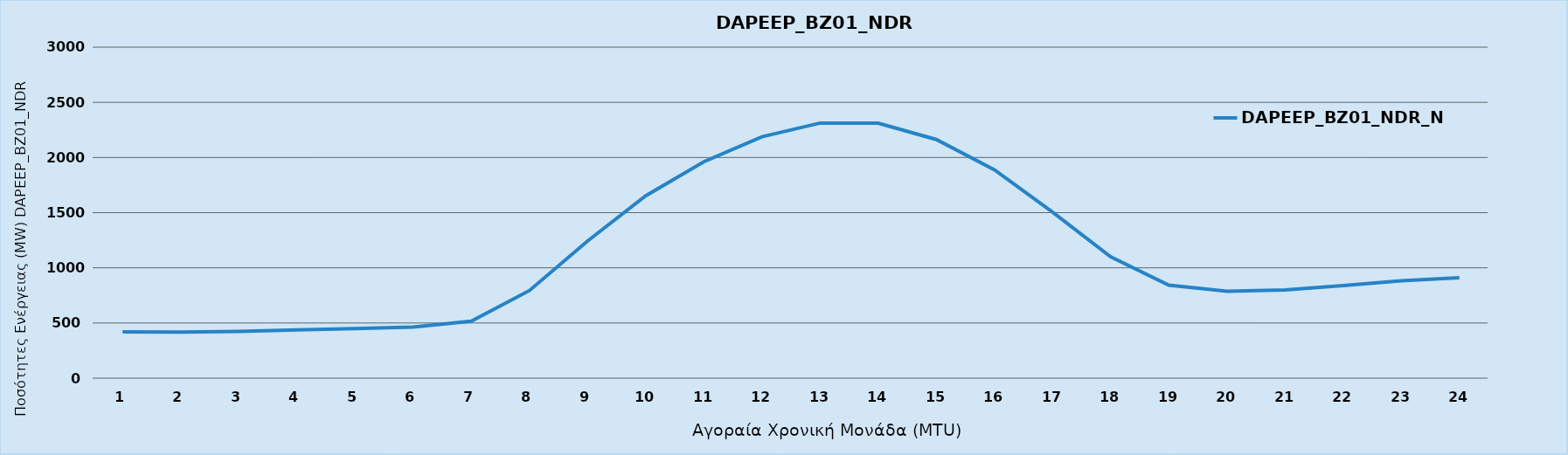
| Category | DAPEEP_BZ01_NDR_N1 |
|---|---|
| 0 | 419 |
| 1 | 417 |
| 2 | 424 |
| 3 | 437 |
| 4 | 450 |
| 5 | 463 |
| 6 | 516 |
| 7 | 794 |
| 8 | 1243 |
| 9 | 1653 |
| 10 | 1961 |
| 11 | 2188 |
| 12 | 2312 |
| 13 | 2311 |
| 14 | 2163 |
| 15 | 1888 |
| 16 | 1505 |
| 17 | 1099 |
| 18 | 843 |
| 19 | 787 |
| 20 | 799 |
| 21 | 839 |
| 22 | 882 |
| 23 | 911 |